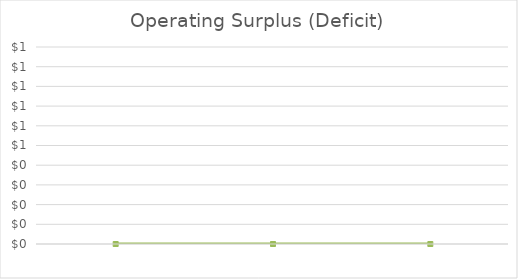
| Category | Operating Surplus (Deficit) |
|---|---|
|  | 0 |
|  | 0 |
|  | 0 |